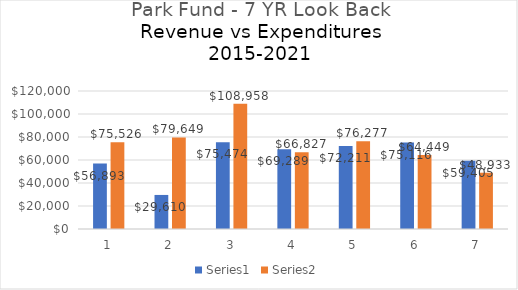
| Category | Series 0 | Series 1 |
|---|---|---|
| 0 | 56893 | 75526 |
| 1 | 29610 | 79649 |
| 2 | 75474 | 108958 |
| 3 | 69289 | 66827 |
| 4 | 72211 | 76277 |
| 5 | 75116 | 64449 |
| 6 | 59405 | 48933 |